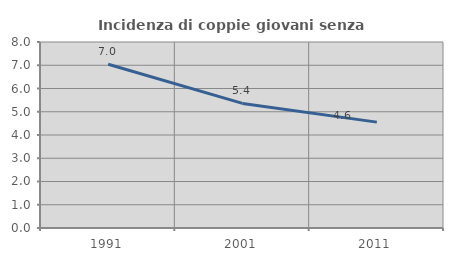
| Category | Incidenza di coppie giovani senza figli |
|---|---|
| 1991.0 | 7.045 |
| 2001.0 | 5.359 |
| 2011.0 | 4.553 |